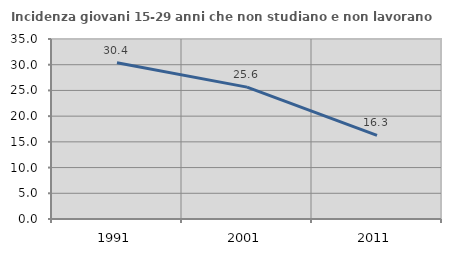
| Category | Incidenza giovani 15-29 anni che non studiano e non lavorano  |
|---|---|
| 1991.0 | 30.388 |
| 2001.0 | 25.641 |
| 2011.0 | 16.25 |